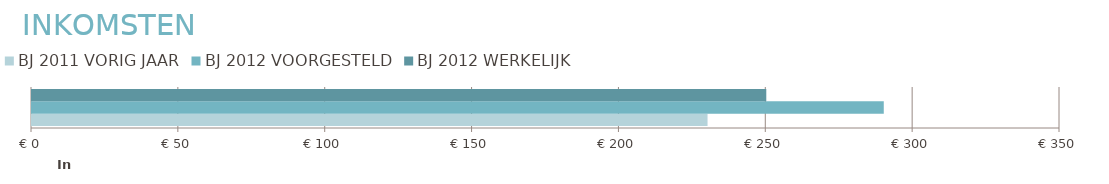
| Category | BJ 2011 | BJ 2012 |
|---|---|---|
| 0 | 230000 | 250000 |